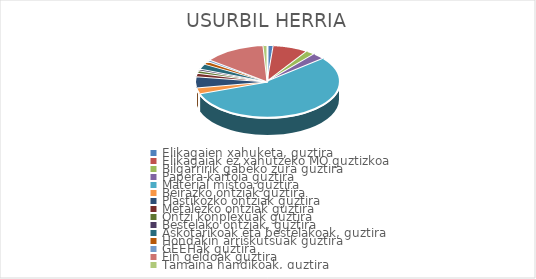
| Category | USURBIL HERRIA |
|---|---|
| Elikagaien xahuketa, guztira | 0.014 |
| Elikagaiak ez xahutzeko MO guztizkoa | 0.079 |
| Bilgarririk gabeko zura guztira | 0.02 |
| Papera-kartoia guztira | 0.028 |
| Material mistoa guztira | 0.555 |
| Beirazko ontziak guztira | 0.027 |
| Plastikozko ontziak guztira | 0.05 |
| Metalezko ontziak guztira | 0.015 |
| Ontzi konplexuak guztira | 0.012 |
| Bestelako ontziak, guztira | 0.007 |
| Askotarikoak eta bestelakoak, guztira | 0.024 |
| Hondakin arriskutsuak guztira | 0.014 |
| GEEHak guztira | 0.008 |
| Fin geldoak guztira | 0.138 |
| Tamaina handikoak, guztira | 0.009 |